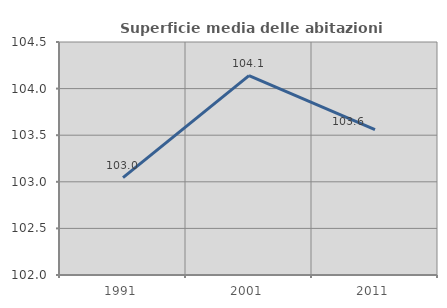
| Category | Superficie media delle abitazioni occupate |
|---|---|
| 1991.0 | 103.045 |
| 2001.0 | 104.138 |
| 2011.0 | 103.561 |